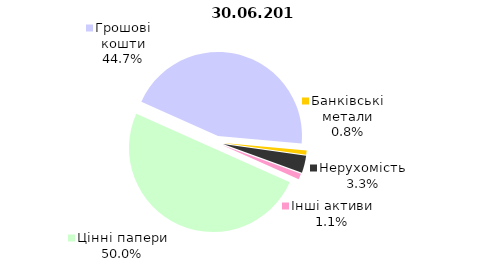
| Category | Всього |
|---|---|
| Цінні папери | 556.331 |
| Грошові кошти | 497.272 |
| Банківські метали | 9.109 |
| Нерухомість | 36.645 |
| Інші активи | 12.443 |